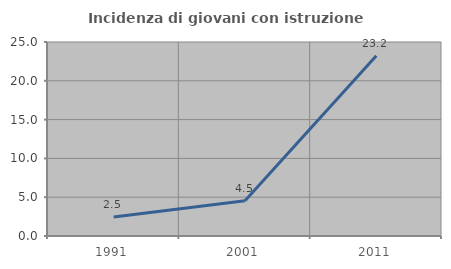
| Category | Incidenza di giovani con istruzione universitaria |
|---|---|
| 1991.0 | 2.463 |
| 2001.0 | 4.545 |
| 2011.0 | 23.243 |